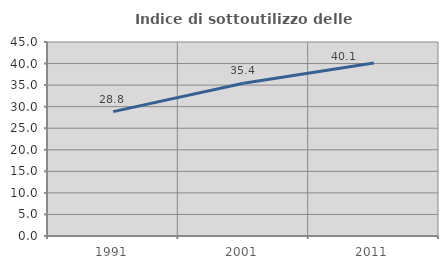
| Category | Indice di sottoutilizzo delle abitazioni  |
|---|---|
| 1991.0 | 28.846 |
| 2001.0 | 35.437 |
| 2011.0 | 40.104 |